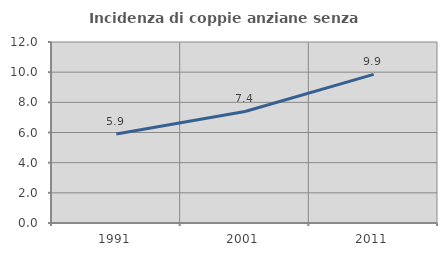
| Category | Incidenza di coppie anziane senza figli  |
|---|---|
| 1991.0 | 5.9 |
| 2001.0 | 7.393 |
| 2011.0 | 9.854 |